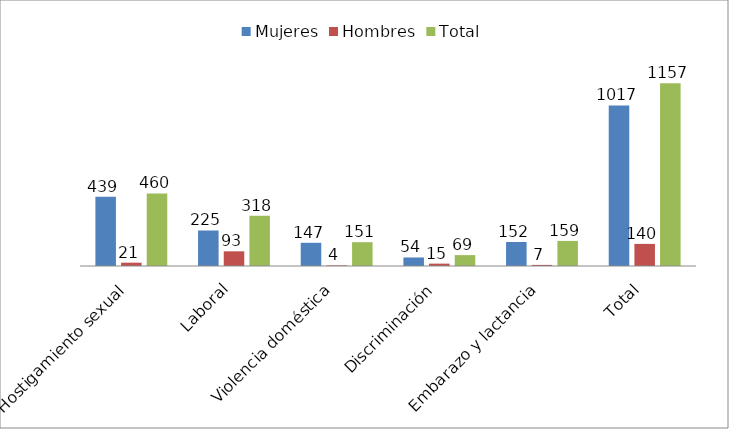
| Category | Mujeres | Hombres | Total |
|---|---|---|---|
| Hostigamiento sexual | 439 | 21 | 460 |
| Laboral | 225 | 93 | 318 |
| Violencia doméstica | 147 | 4 | 151 |
| Discriminación | 54 | 15 | 69 |
| Embarazo y lactancia | 152 | 7 | 159 |
| Total | 1017 | 140 | 1157 |